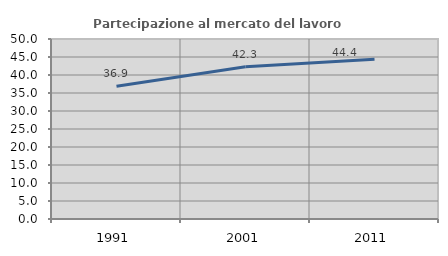
| Category | Partecipazione al mercato del lavoro  femminile |
|---|---|
| 1991.0 | 36.89 |
| 2001.0 | 42.31 |
| 2011.0 | 44.388 |